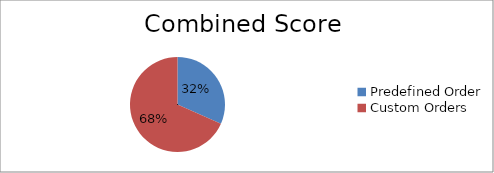
| Category | Sorting Order |
|---|---|
| Predefined Order | 50 |
| Custom Orders | 108 |